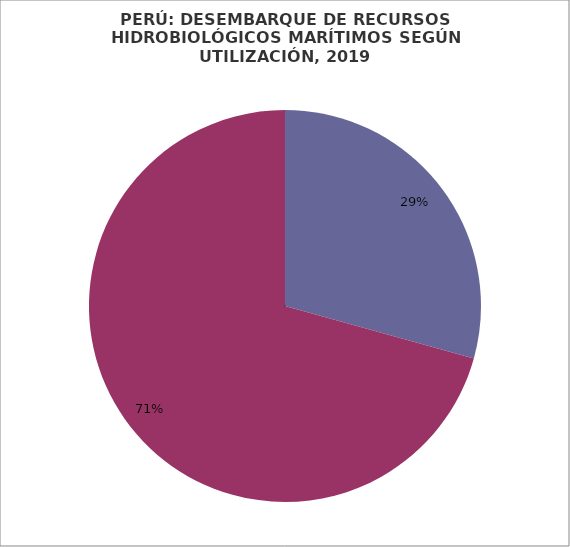
| Category | Series 0 |
|---|---|
| Consumo Humano Directo | 1402601.013 |
| Consumo Humano Indirecto | 3382087.025 |